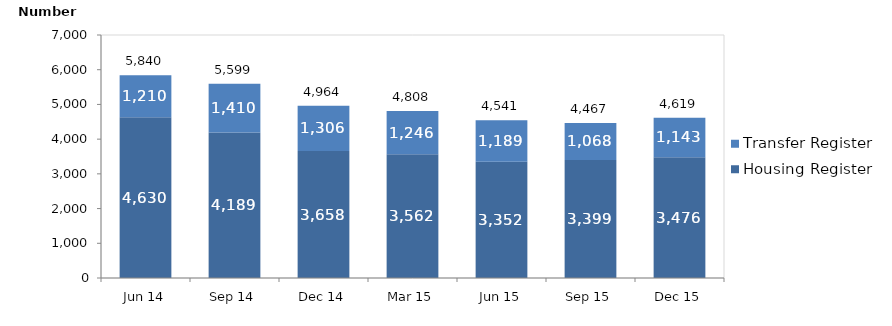
| Category | Housing Register | Transfer Register |
|---|---|---|
| Jun 14 | 4630 | 1210 |
| Sep 14 | 4189 | 1410 |
| Dec 14 | 3658 | 1306 |
| Mar 15 | 3562 | 1246 |
| Jun 15 | 3352 | 1189 |
| Sep 15 | 3399 | 1068 |
| Dec 15 | 3476 | 1143 |